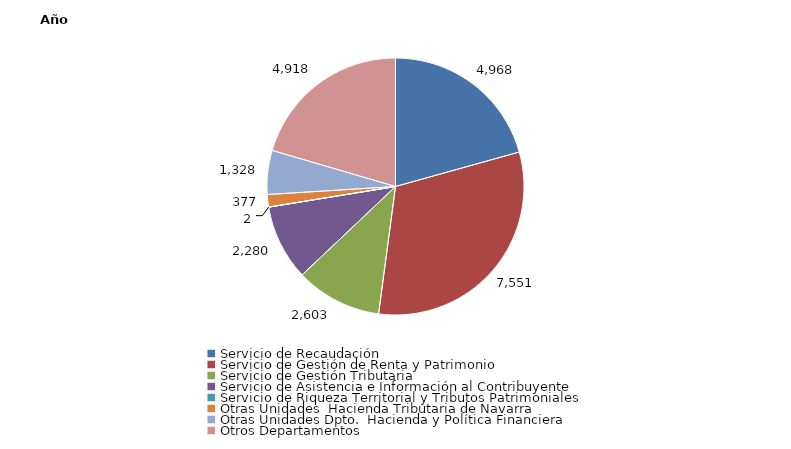
| Category | Series 0 |
|---|---|
| Servicio de Recaudación | 4968 |
| Servicio de Gestión de Renta y Patrimonio | 7551 |
| Servicio de Gestión Tributaria | 2603 |
| Servicio de Asistencia e Información al Contribuyente | 2280 |
| Servicio de Riqueza Territorial y Tributos Patrimoniales | 2 |
| Otras Unidades  Hacienda Tributaria de Navarra | 377 |
| Otras Unidades Dpto.  Hacienda y Política Financiera | 1328 |
| Otros Departamentos | 4918 |